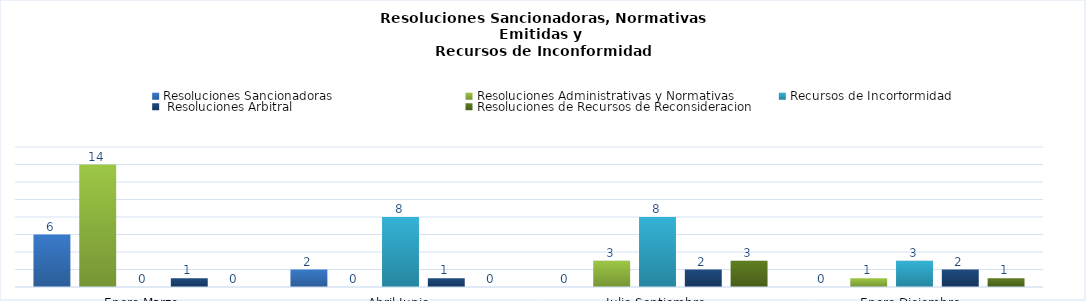
| Category | Resoluciones Sancionadoras | Resoluciones Administrativas y Normativas | Recursos de Incorformidad |  Resoluciones Arbitral | Resoluciones de Recursos de Reconsideracion |
|---|---|---|---|---|---|
| Enero-Marzo | 6 | 14 | 0 | 1 | 0 |
| Abril-Junio | 2 | 0 | 8 | 1 | 0 |
| Julio-Septiembre | 0 | 3 | 8 | 2 | 3 |
| Enero-Diciembre  | 0 | 1 | 3 | 2 | 1 |